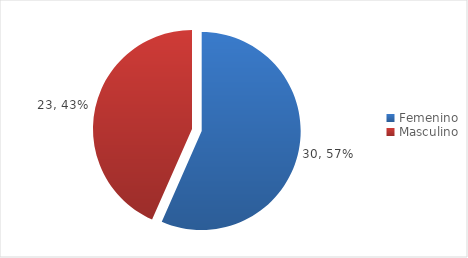
| Category | Series 0 |
|---|---|
| Femenino | 30 |
| Masculino | 23 |